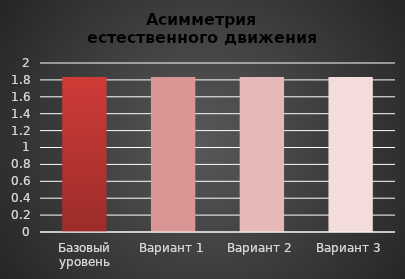
| Category | Общая асимметрия социального развития региона |
|---|---|
| Базовый уровень | 1.835 |
| Вариант 1 | 1.835 |
| Вариант 2 | 1.835 |
| Вариант 3 | 1.835 |